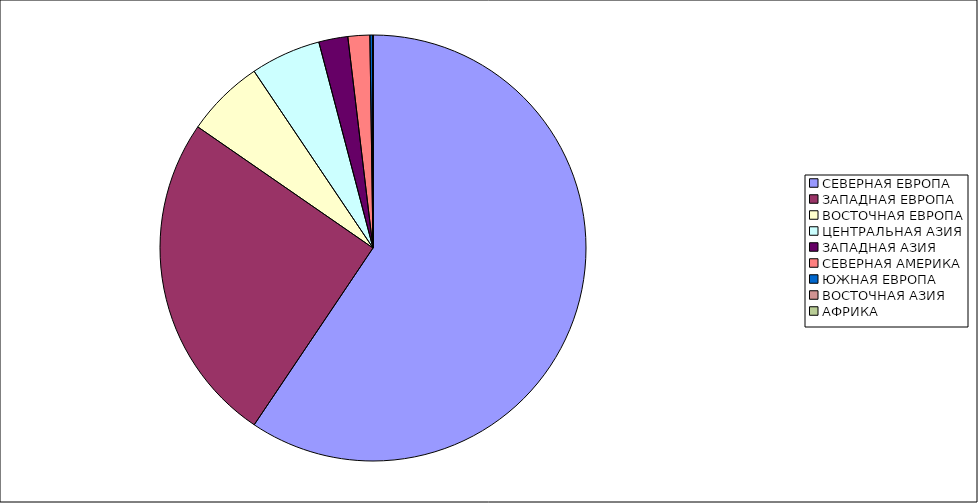
| Category | Оборот |
|---|---|
| СЕВЕРНАЯ ЕВРОПА | 59.417 |
| ЗАПАДНАЯ ЕВРОПА | 25.209 |
| ВОСТОЧНАЯ ЕВРОПА | 5.949 |
| ЦЕНТРАЛЬНАЯ АЗИЯ | 5.329 |
| ЗАПАДНАЯ АЗИЯ | 2.206 |
| СЕВЕРНАЯ АМЕРИКА | 1.658 |
| ЮЖНАЯ ЕВРОПА | 0.23 |
| ВОСТОЧНАЯ АЗИЯ | 0.002 |
| АФРИКА | 0.001 |